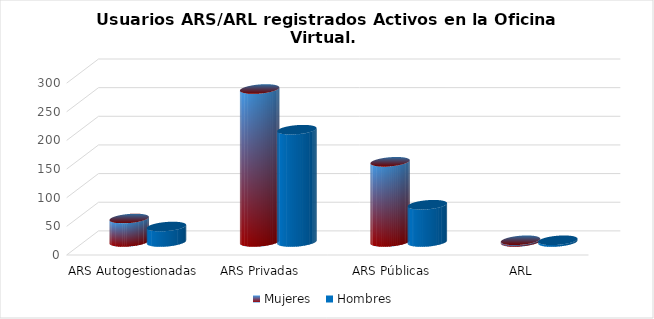
| Category | Mujeres | Hombres |
|---|---|---|
| ARS Autogestionadas | 41 | 27 |
| ARS Privadas | 267 | 196 |
| ARS Públicas | 140 | 65 |
| ARL | 3 | 3 |